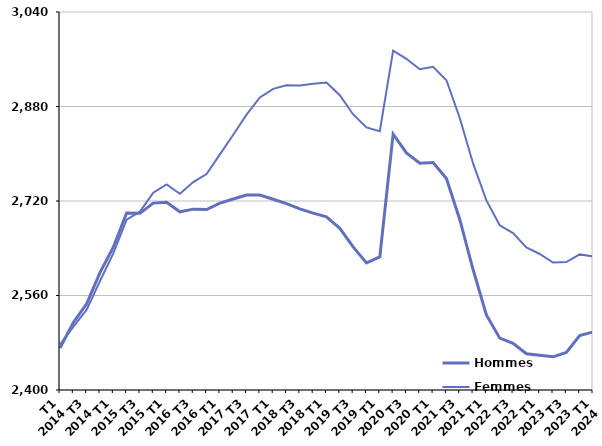
| Category | Hommes  | Femmes  |
|---|---|---|
| T1
2014 | 2471.1 | 2477.4 |
| T2
2014 | 2514.2 | 2506.8 |
| T3
2014 | 2545.9 | 2535.9 |
| T4
2014 | 2598.7 | 2584.6 |
| T1
2015 | 2641.7 | 2631.3 |
| T2
2015 | 2699.6 | 2688.3 |
| T3
2015 | 2699.1 | 2701.9 |
| T4
2015 | 2716.4 | 2734 |
| T1
2016 | 2718 | 2747.9 |
| T2
2016 | 2701.7 | 2732.1 |
| T3
2016 | 2706.2 | 2752 |
| T4
2016 | 2705.5 | 2765.5 |
| T1
2017 | 2716.3 | 2798.9 |
| T2
2017 | 2723.4 | 2832.1 |
| T3
2017 | 2730 | 2866.3 |
| T4
2017 | 2730.1 | 2895.3 |
| T1
2018 | 2723 | 2909.9 |
| T2
2018 | 2715.5 | 2915.9 |
| T3
2018 | 2706.6 | 2915.5 |
| T4
2018 | 2699.4 | 2918.7 |
| T1
2019 | 2693.1 | 2920.6 |
| T2
2019 | 2673.8 | 2899.1 |
| T3
2019 | 2642.3 | 2866.5 |
| T4
2019 | 2615.3 | 2844.6 |
| T1
2020 | 2625.2 | 2838.1 |
| T2
2020 | 2833.1 | 2974.6 |
| T3
2020 | 2801.4 | 2960.8 |
| T4
2020 | 2783.9 | 2943.2 |
| T1
2021 | 2785.2 | 2947.3 |
| T2
2021 | 2758 | 2924.5 |
| T3
2021 | 2688.7 | 2860.5 |
| T4
2021 | 2604 | 2783.6 |
| T1
2022 | 2527.2 | 2721 |
| T2
2022 | 2487.8 | 2678.9 |
| T3
2022 | 2479.1 | 2665.7 |
| T4
2022 | 2461.4 | 2641.3 |
| T1
2023 | 2458.7 | 2630.3 |
| T2
2023 | 2456.2 | 2615.8 |
| T3
2023 | 2463.6 | 2616.6 |
| T4
2023 | 2492 | 2629.6 |
| T1
2024 | 2498.2 | 2626 |